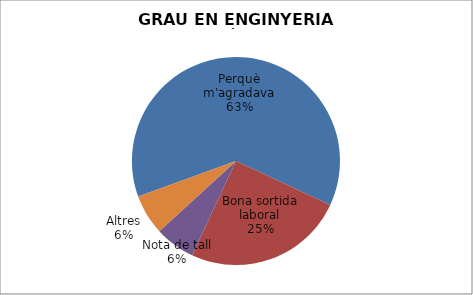
| Category | GRAU EN ENGINYERIA MECÀNICA |
|---|---|
| Perquè m'agradava | 10 |
| Bona sortida laboral | 4 |
| S'hi matriculaven les amistats | 0 |
| Nota de tall | 1 |
|  Consells familiars/amistats | 0 |
| Altres | 1 |